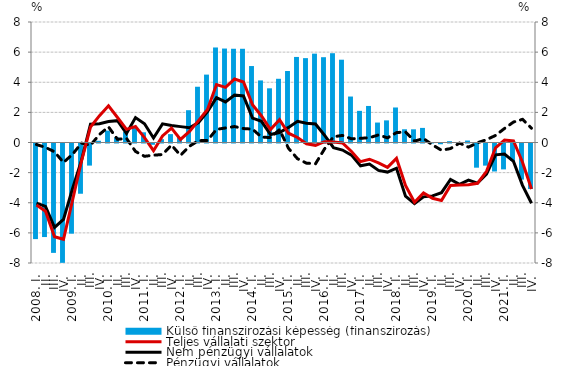
| Category | Külső finanszírozási képesség (finanszírozás) |
|---|---|
| 2008. I. | -6.347 |
| II. | -6.211 |
| III. | -7.262 |
| IV. | -7.922 |
| 2009. I. | -5.987 |
|          II. | -3.336 |
|          III. | -1.467 |
|          IV. | 0.114 |
| 2010. I. | 0.788 |
|          II. | 0.342 |
|          III. | 0.697 |
|          IV. | 1.087 |
| 2011. I. | 0.678 |
|          II. | -0.085 |
|          III. | 0.221 |
|          IV. | 0.556 |
| 2012. I. | 0.346 |
|          II. | 2.144 |
|          III. | 3.702 |
|          IV. | 4.508 |
| 2013. I. | 6.308 |
| II. | 6.238 |
|          III. | 6.224 |
| IV. | 6.222 |
| 2014. I. | 5.076 |
| II. | 4.121 |
|          III. | 3.597 |
| IV. | 4.23 |
| 2015. I. | 4.745 |
| II. | 5.68 |
|          III. | 5.601 |
| IV. | 5.899 |
| 2016. I. | 5.663 |
| II. | 5.928 |
|          III. | 5.497 |
| IV. | 3.052 |
| 2017. I. | 2.102 |
| II. | 2.426 |
|          III. | 1.324 |
| IV. | 1.469 |
| 2018. I. | 2.325 |
| II. | 0.878 |
|          III. | 0.876 |
| IV. | 0.969 |
| 2019. I. | -0.002 |
| II. | -0.049 |
|          III. | 0.088 |
| IV. | 0.005 |
| 2020. I. | 0.131 |
| II. | -1.606 |
|          III. | -1.47 |
| IV. | -1.857 |
| 2021. I. | -1.719 |
| II. | -1.158 |
|          III. | -2.399 |
| IV. | -3.024 |